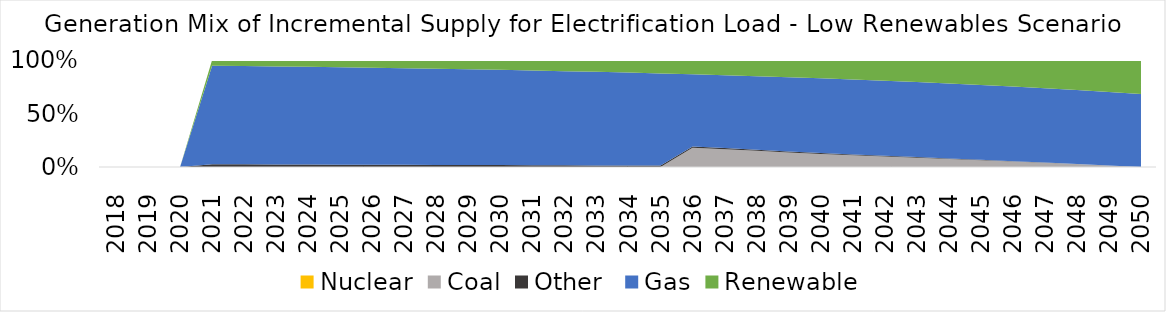
| Category | Nuclear | Coal | Other  | Gas | Renewable |
|---|---|---|---|---|---|
| 2018.0 | 0 | 0 | 0 | 0 | 0 |
| 2019.0 | 0 | 0 | 0 | 0 | 0 |
| 2020.0 | 0 | 0 | 0 | 0 | 0 |
| 2021.0 | 0 | 0 | 0.025 | 0.922 | 0.053 |
| 2022.0 | 0 | 0 | 0.025 | 0.919 | 0.056 |
| 2023.0 | 0 | 0 | 0.024 | 0.917 | 0.06 |
| 2024.0 | 0 | 0 | 0.023 | 0.914 | 0.064 |
| 2025.0 | 0 | 0 | 0.022 | 0.91 | 0.068 |
| 2026.0 | 0 | 0 | 0.021 | 0.907 | 0.072 |
| 2027.0 | 0 | 0 | 0.02 | 0.903 | 0.077 |
| 2028.0 | 0 | 0 | 0.019 | 0.899 | 0.081 |
| 2029.0 | 0 | 0 | 0.018 | 0.895 | 0.087 |
| 2030.0 | 0 | 0 | 0.018 | 0.89 | 0.092 |
| 2031.0 | 0 | 0 | 0.017 | 0.885 | 0.098 |
| 2032.0 | 0 | 0 | 0.016 | 0.88 | 0.104 |
| 2033.0 | 0 | 0 | 0.015 | 0.874 | 0.111 |
| 2034.0 | 0 | 0 | 0.014 | 0.868 | 0.118 |
| 2035.0 | 0 | 0 | 0.013 | 0.861 | 0.125 |
| 2036.0 | 0 | 0.18 | 0.012 | 0.675 | 0.134 |
| 2037.0 | 0 | 0.165 | 0.011 | 0.681 | 0.142 |
| 2038.0 | 0 | 0.151 | 0.011 | 0.688 | 0.151 |
| 2039.0 | 0 | 0.136 | 0.01 | 0.693 | 0.161 |
| 2040.0 | 0 | 0.122 | 0.009 | 0.698 | 0.171 |
| 2041.0 | 0 | 0.11 | 0.008 | 0.7 | 0.182 |
| 2042.0 | 0 | 0.098 | 0.007 | 0.701 | 0.194 |
| 2043.0 | 0 | 0.086 | 0.006 | 0.702 | 0.206 |
| 2044.0 | 0 | 0.074 | 0.005 | 0.701 | 0.219 |
| 2045.0 | 0 | 0.063 | 0.004 | 0.7 | 0.233 |
| 2046.0 | 0 | 0.051 | 0.004 | 0.698 | 0.248 |
| 2047.0 | 0 | 0.039 | 0.003 | 0.695 | 0.264 |
| 2048.0 | 0 | 0.027 | 0.002 | 0.691 | 0.281 |
| 2049.0 | 0 | 0.013 | 0.001 | 0.687 | 0.298 |
| 2050.0 | 0 | 0 | 0 | 0.683 | 0.317 |